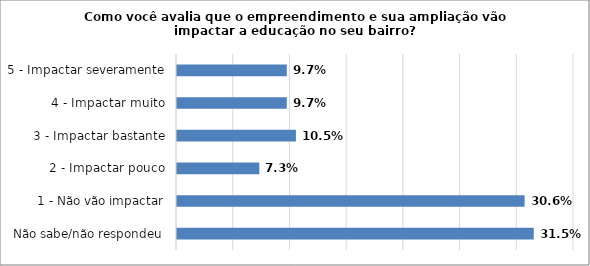
| Category | Series 0 |
|---|---|
| Não sabe/não respondeu | 0.315 |
| 1 - Não vão impactar | 0.306 |
| 2 - Impactar pouco | 0.073 |
| 3 - Impactar bastante | 0.105 |
| 4 - Impactar muito | 0.097 |
| 5 - Impactar severamente | 0.097 |